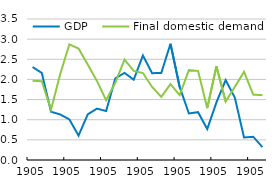
| Category | GDP | Final domestic demand |
|---|---|---|
| 1905-07-03 | 2.307 | 1.965 |
| 1905-07-03 | 2.161 | 1.957 |
| 1905-07-03 | 1.198 | 1.25 |
| 1905-07-03 | 1.13 | 2.127 |
| 1905-07-04 | 1.008 | 2.872 |
| 1905-07-04 | 0.605 | 2.765 |
| 1905-07-04 | 1.133 | 2.37 |
| 1905-07-04 | 1.275 | 1.963 |
| 1905-07-05 | 1.215 | 1.484 |
| 1905-07-05 | 2.027 | 1.919 |
| 1905-07-05 | 2.163 | 2.491 |
| 1905-07-05 | 1.993 | 2.211 |
| 1905-07-06 | 2.595 | 2.158 |
| 1905-07-06 | 2.155 | 1.814 |
| 1905-07-06 | 2.16 | 1.566 |
| 1905-07-06 | 2.884 | 1.881 |
| 1905-07-07 | 1.814 | 1.613 |
| 1905-07-07 | 1.154 | 2.23 |
| 1905-07-07 | 1.187 | 2.212 |
| 1905-07-07 | 0.771 | 1.287 |
| 1905-07-08 | 1.429 | 2.325 |
| 1905-07-08 | 1.982 | 1.45 |
| 1905-07-08 | 1.549 | 1.814 |
| 1905-07-08 | 0.559 | 2.189 |
| 1905-07-09 | 0.578 | 1.623 |
| 1905-07-09 | 0.319 | 1.609 |